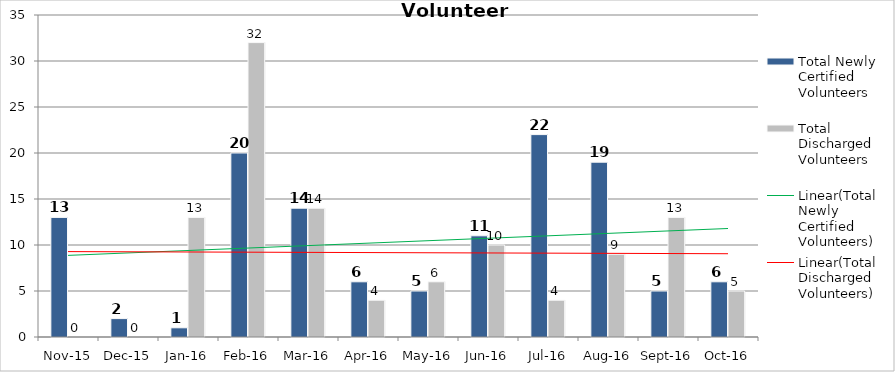
| Category | Total Newly Certified Volunteers | Total Discharged Volunteers |
|---|---|---|
| Nov-15 | 13 | 0 |
| Dec-15 | 2 | 0 |
| Jan-16 | 1 | 13 |
| Feb-16 | 20 | 32 |
| Mar-16 | 14 | 14 |
| Apr-16 | 6 | 4 |
| May-16 | 5 | 6 |
| Jun-16 | 11 | 10 |
| Jul-16 | 22 | 4 |
| Aug-16 | 19 | 9 |
| Sep-16 | 5 | 13 |
| Oct-16 | 6 | 5 |